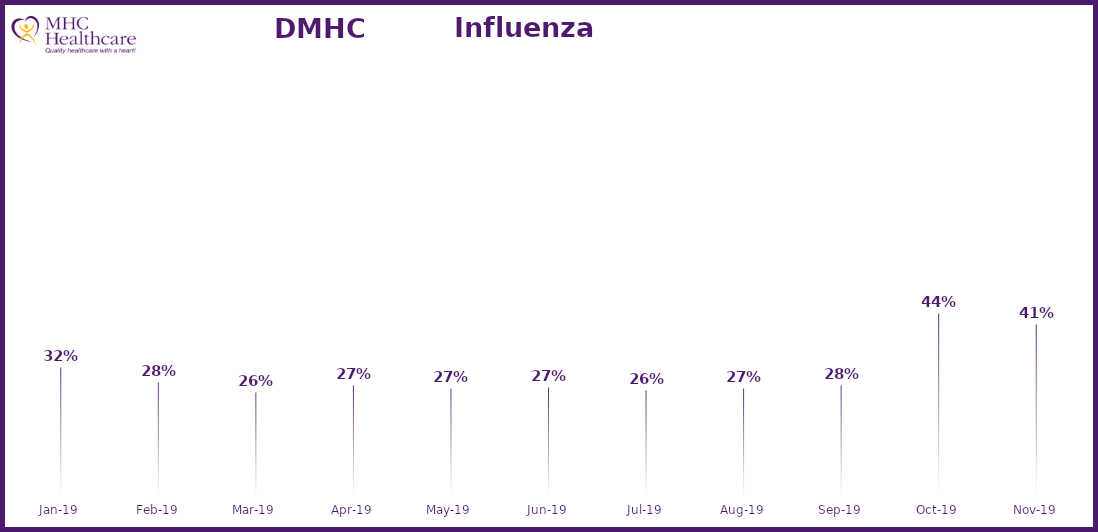
| Category | Online Access to Health Information |
|---|---|
| 2019-01-01 | 0.316 |
| 2019-02-01 | 0.281 |
| 2019-03-01 | 0.26 |
| 2019-04-01 | 0.274 |
| 2019-05-01 | 0.268 |
| 2019-06-01 | 0.269 |
| 2019-07-01 | 0.264 |
| 2019-08-01 | 0.268 |
| 2019-09-01 | 0.276 |
| 2019-10-01 | 0.438 |
| 2019-11-01 | 0.411 |